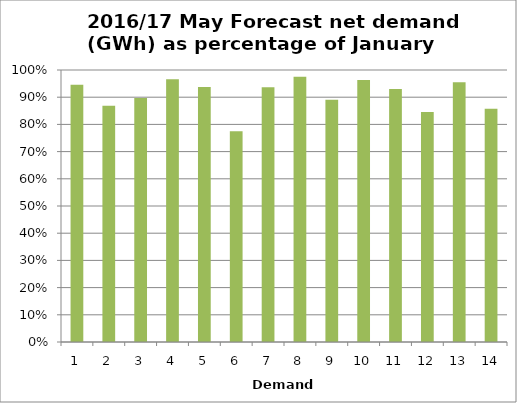
| Category | 2016/17
May Forecast
Net Demand 
(GWh) |
|---|---|
| 0 | 0.946 |
| 1 | 0.869 |
| 2 | 0.897 |
| 3 | 0.966 |
| 4 | 0.937 |
| 5 | 0.775 |
| 6 | 0.937 |
| 7 | 0.975 |
| 8 | 0.891 |
| 9 | 0.963 |
| 10 | 0.93 |
| 11 | 0.845 |
| 12 | 0.955 |
| 13 | 0.858 |